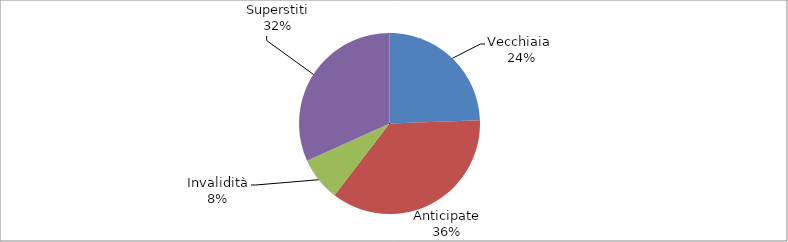
| Category | Series 0 |
|---|---|
| Vecchiaia  | 61175 |
| Anticipate | 90152 |
| Invalidità | 19607 |
| Superstiti | 79550 |